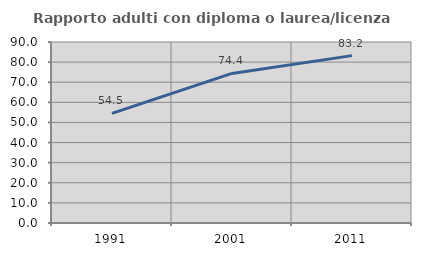
| Category | Rapporto adulti con diploma o laurea/licenza media  |
|---|---|
| 1991.0 | 54.545 |
| 2001.0 | 74.366 |
| 2011.0 | 83.231 |